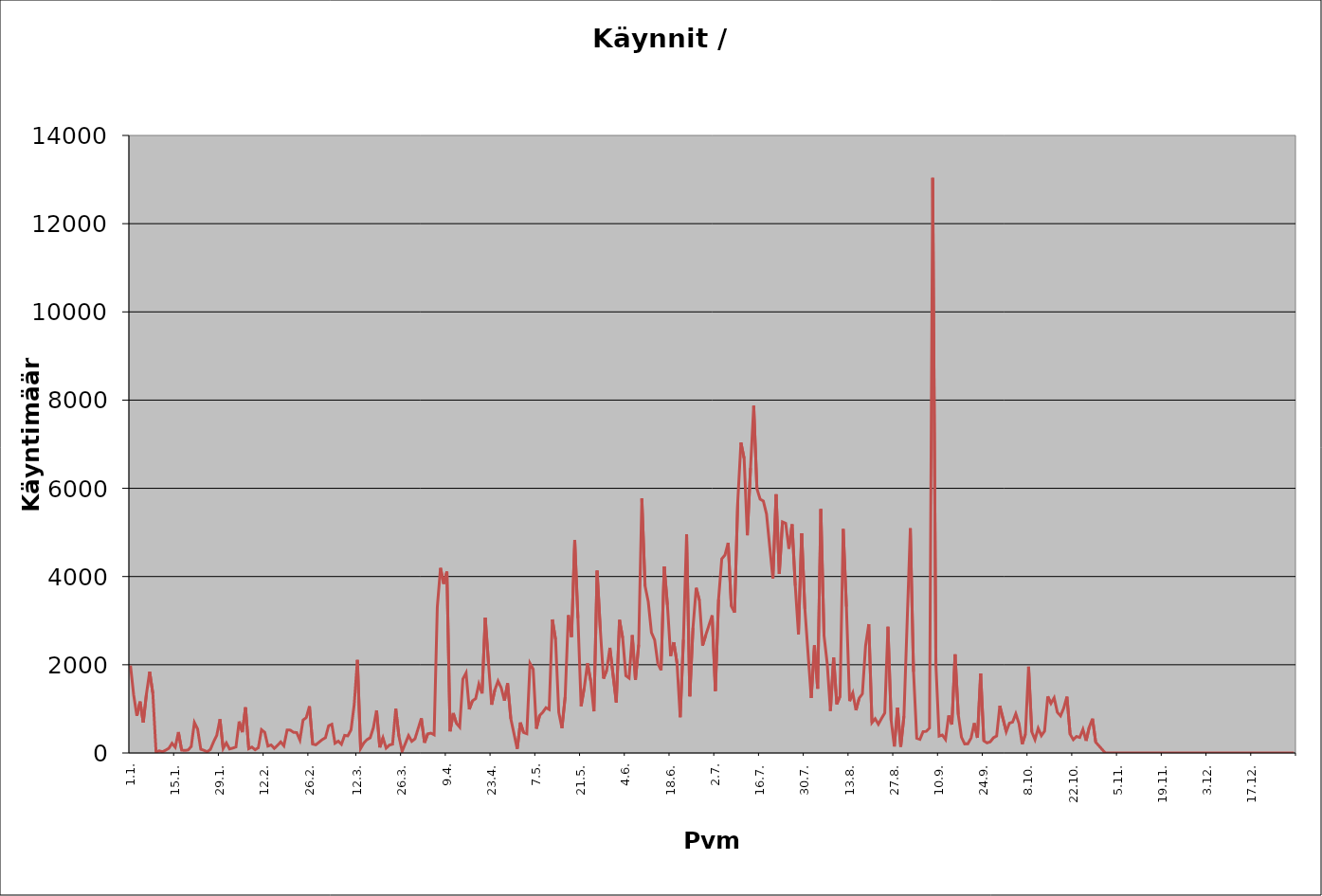
| Category | Series 1 |
|---|---|
| 0 | 1985 |
| 1 | 1315 |
| 2 | 844 |
| 3 | 1165 |
| 4 | 689 |
| 5 | 1343 |
| 6 | 1843 |
| 7 | 1351 |
| 8 | 21 |
| 9 | 49 |
| 10 | 27 |
| 11 | 63 |
| 12 | 106 |
| 13 | 219 |
| 14 | 131 |
| 15 | 474 |
| 16 | 65 |
| 17 | 57 |
| 18 | 67 |
| 19 | 145 |
| 20 | 691 |
| 21 | 544 |
| 22 | 84 |
| 23 | 59 |
| 24 | 28 |
| 25 | 80 |
| 26 | 252 |
| 27 | 401 |
| 28 | 766 |
| 29 | 102 |
| 30 | 228 |
| 31 | 91 |
| 32 | 111 |
| 33 | 136 |
| 34 | 713 |
| 35 | 471 |
| 36 | 1035 |
| 37 | 98 |
| 38 | 133 |
| 39 | 73 |
| 40 | 119 |
| 41 | 528 |
| 42 | 468 |
| 43 | 156 |
| 44 | 182 |
| 45 | 104 |
| 46 | 171 |
| 47 | 251 |
| 48 | 162 |
| 49 | 521 |
| 50 | 518 |
| 51 | 469 |
| 52 | 462 |
| 53 | 293 |
| 54 | 747 |
| 55 | 802 |
| 56 | 1058 |
| 57 | 201 |
| 58 | 186 |
| 59 | 0 |
| 60 | 303 |
| 61 | 346 |
| 62 | 617 |
| 63 | 650 |
| 64 | 221 |
| 65 | 268 |
| 66 | 196 |
| 67 | 399 |
| 68 | 388 |
| 69 | 523 |
| 70 | 1099 |
| 71 | 2109 |
| 72 | 101 |
| 73 | 227 |
| 74 | 304 |
| 75 | 346 |
| 76 | 573 |
| 77 | 965 |
| 78 | 128 |
| 79 | 344 |
| 80 | 110 |
| 81 | 180 |
| 82 | 199 |
| 83 | 1003 |
| 84 | 374 |
| 85 | 37 |
| 86 | 215 |
| 87 | 395 |
| 88 | 264 |
| 89 | 319 |
| 90 | 0 |
| 91 | 785 |
| 92 | 233 |
| 93 | 432 |
| 94 | 450 |
| 95 | 412 |
| 96 | 3311 |
| 97 | 4194 |
| 98 | 3835 |
| 99 | 4110 |
| 100 | 491 |
| 101 | 904 |
| 102 | 671 |
| 103 | 585 |
| 104 | 1679 |
| 105 | 1815 |
| 106 | 990 |
| 107 | 1183 |
| 108 | 1232 |
| 109 | 1562 |
| 110 | 1350 |
| 111 | 3068 |
| 112 | 2059 |
| 113 | 1094 |
| 114 | 1429 |
| 115 | 1630 |
| 116 | 1476 |
| 117 | 1187 |
| 118 | 1580 |
| 119 | 777 |
| 120 | 0 |
| 121 | 94 |
| 122 | 690 |
| 123 | 464 |
| 124 | 438 |
| 125 | 2030 |
| 126 | 1900 |
| 127 | 551 |
| 128 | 847 |
| 129 | 924 |
| 130 | 1027 |
| 131 | 987 |
| 132 | 3026 |
| 133 | 2575 |
| 134 | 920 |
| 135 | 562 |
| 136 | 1268 |
| 137 | 3123 |
| 138 | 2629 |
| 139 | 4824 |
| 140 | 3057 |
| 141 | 1061 |
| 142 | 1489 |
| 143 | 2034 |
| 144 | 1635 |
| 145 | 944 |
| 146 | 4134 |
| 147 | 2798 |
| 148 | 1686 |
| 149 | 1873 |
| 150 | 2384 |
| 151 | 0 |
| 152 | 1146 |
| 153 | 3016 |
| 154 | 2611 |
| 155 | 1750 |
| 156 | 1698 |
| 157 | 2669 |
| 158 | 1658 |
| 159 | 2453 |
| 160 | 5770 |
| 161 | 3788 |
| 162 | 3430 |
| 163 | 2730 |
| 164 | 2565 |
| 165 | 2028 |
| 166 | 1876 |
| 167 | 4229 |
| 168 | 3357 |
| 169 | 2198 |
| 170 | 2510 |
| 171 | 2037 |
| 172 | 810 |
| 173 | 2568 |
| 174 | 4958 |
| 175 | 1285 |
| 176 | 2840 |
| 177 | 3743 |
| 178 | 3461 |
| 179 | 2434 |
| 180 | 2673 |
| 181 | 0 |
| 182 | 3120 |
| 183 | 1405 |
| 184 | 3482 |
| 185 | 4399 |
| 186 | 4487 |
| 187 | 4763 |
| 188 | 3328 |
| 189 | 3185 |
| 190 | 5695 |
| 191 | 7036 |
| 192 | 6677 |
| 193 | 4936 |
| 194 | 6460 |
| 195 | 7873 |
| 196 | 5993 |
| 197 | 5754 |
| 198 | 5713 |
| 199 | 5421 |
| 200 | 4685 |
| 201 | 3955 |
| 202 | 5864 |
| 203 | 4062 |
| 204 | 5238 |
| 205 | 5207 |
| 206 | 4631 |
| 207 | 5183 |
| 208 | 3793 |
| 209 | 2689 |
| 210 | 4982 |
| 211 | 3270 |
| 212 | 0 |
| 213 | 1246 |
| 214 | 2440 |
| 215 | 1457 |
| 216 | 5528 |
| 217 | 2660 |
| 218 | 2020 |
| 219 | 955 |
| 220 | 2168 |
| 221 | 1105 |
| 222 | 1285 |
| 223 | 5079 |
| 224 | 3317 |
| 225 | 1176 |
| 226 | 1359 |
| 227 | 969 |
| 228 | 1241 |
| 229 | 1341 |
| 230 | 2432 |
| 231 | 2919 |
| 232 | 688 |
| 233 | 776 |
| 234 | 649 |
| 235 | 782 |
| 236 | 907 |
| 237 | 2860 |
| 238 | 744 |
| 239 | 147 |
| 240 | 1027 |
| 241 | 144 |
| 242 | 835 |
| 243 | 0 |
| 244 | 5094 |
| 245 | 1841 |
| 246 | 334 |
| 247 | 310 |
| 248 | 485 |
| 249 | 491 |
| 250 | 564 |
| 251 | 13039 |
| 252 | 2002 |
| 253 | 383 |
| 254 | 408 |
| 255 | 307 |
| 256 | 850 |
| 257 | 645 |
| 258 | 2235 |
| 259 | 869 |
| 260 | 356 |
| 261 | 207 |
| 262 | 210 |
| 263 | 341 |
| 264 | 677 |
| 265 | 343 |
| 266 | 1801 |
| 267 | 276 |
| 268 | 227 |
| 269 | 252 |
| 270 | 343 |
| 271 | 385 |
| 272 | 1070 |
| 273 | 0 |
| 274 | 483 |
| 275 | 676 |
| 276 | 701 |
| 277 | 890 |
| 278 | 666 |
| 279 | 200 |
| 280 | 427 |
| 281 | 1956 |
| 282 | 478 |
| 283 | 304 |
| 284 | 560 |
| 285 | 393 |
| 286 | 495 |
| 287 | 1282 |
| 288 | 1124 |
| 289 | 1251 |
| 290 | 922 |
| 291 | 842 |
| 292 | 1019 |
| 293 | 1277 |
| 294 | 423 |
| 295 | 302 |
| 296 | 373 |
| 297 | 352 |
| 298 | 535 |
| 299 | 276 |
| 300 | 590 |
| 301 | 778 |
| 302 | 245 |
| 303 | 0 |
| 304 | 0 |
| 305 | 0 |
| 306 | 0 |
| 307 | 0 |
| 308 | 0 |
| 309 | 0 |
| 310 | 0 |
| 311 | 0 |
| 312 | 0 |
| 313 | 0 |
| 314 | 0 |
| 315 | 0 |
| 316 | 0 |
| 317 | 0 |
| 318 | 0 |
| 319 | 0 |
| 320 | 0 |
| 321 | 0 |
| 322 | 0 |
| 323 | 0 |
| 324 | 0 |
| 325 | 0 |
| 326 | 0 |
| 327 | 0 |
| 328 | 0 |
| 329 | 0 |
| 330 | 0 |
| 331 | 0 |
| 332 | 0 |
| 333 | 0 |
| 334 | 0 |
| 335 | 0 |
| 336 | 0 |
| 337 | 0 |
| 338 | 0 |
| 339 | 0 |
| 340 | 0 |
| 341 | 0 |
| 342 | 0 |
| 343 | 0 |
| 344 | 0 |
| 345 | 0 |
| 346 | 0 |
| 347 | 0 |
| 348 | 0 |
| 349 | 0 |
| 350 | 0 |
| 351 | 0 |
| 352 | 0 |
| 353 | 0 |
| 354 | 0 |
| 355 | 0 |
| 356 | 0 |
| 357 | 0 |
| 358 | 0 |
| 359 | 0 |
| 360 | 0 |
| 361 | 0 |
| 362 | 0 |
| 363 | 0 |
| 364 | 0 |